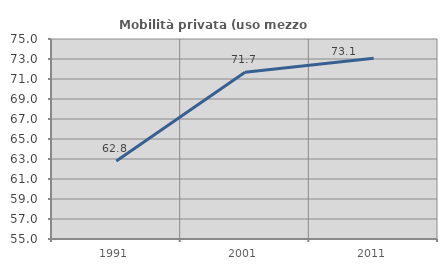
| Category | Mobilità privata (uso mezzo privato) |
|---|---|
| 1991.0 | 62.803 |
| 2001.0 | 71.674 |
| 2011.0 | 73.072 |